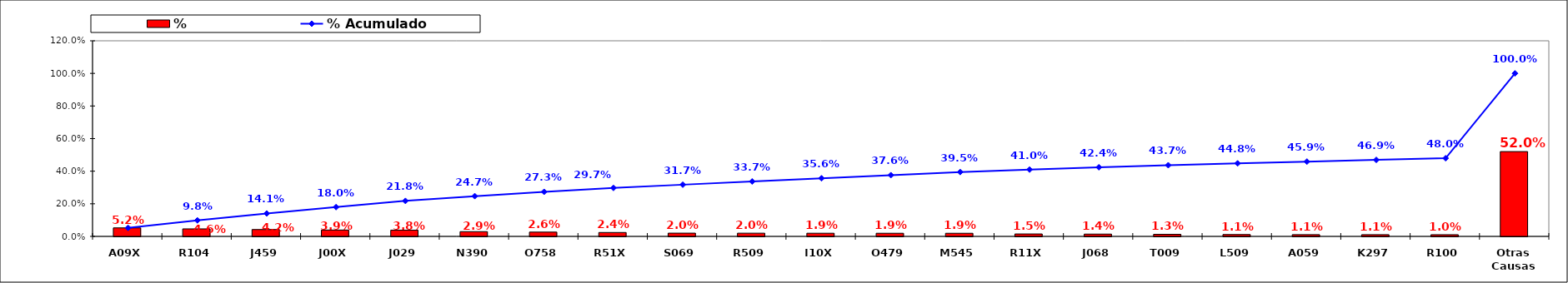
| Category | % |
|---|---|
| A09X | 0.052 |
| R104 | 0.046 |
| J459 | 0.042 |
| J00X | 0.039 |
| J029 | 0.038 |
| N390 | 0.029 |
| O758 | 0.026 |
| R51X | 0.024 |
| S069 | 0.02 |
| R509 | 0.02 |
| I10X | 0.019 |
| O479 | 0.019 |
| M545 | 0.019 |
| R11X | 0.015 |
| J068 | 0.014 |
| T009 | 0.013 |
| L509 | 0.011 |
| A059 | 0.011 |
| K297 | 0.011 |
| R100 | 0.01 |
| Otras Causas | 0.52 |